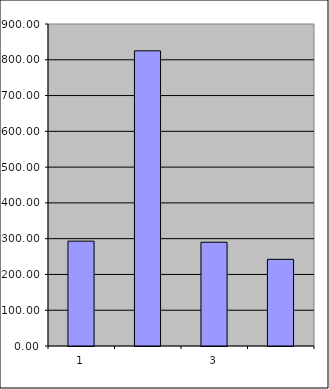
| Category | Series 0 |
|---|---|
| 0 | 293 |
| 1 | 825.023 |
| 2 | 289.99 |
| 3 | 242.172 |